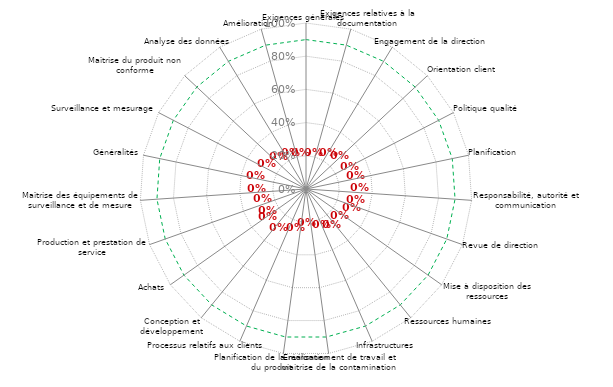
| Category | 90% | Résultats |
|---|---|---|
| 0 | 0.9 | 0 |
| 1 | 0.9 | 0 |
| 2 | 0.9 | 0 |
| 3 | 0.9 | 0 |
| 4 | 0.9 | 0 |
| 5 | 0.9 | 0 |
| 6 | 0.9 | 0 |
| 7 | 0.9 | 0 |
| 8 | 0.9 | 0 |
| 9 | 0.9 | 0 |
| 10 | 0.9 | 0 |
| 11 | 0.9 | 0 |
| 12 | 0.9 | 0 |
| 13 | 0.9 | 0 |
| 14 | 0.9 | 0 |
| 15 | 0.9 | 0 |
| 16 | 0.9 | 0 |
| 17 | 0.9 | 0 |
| 18 | 0.9 | 0 |
| 19 | 0.9 | 0 |
| 20 | 0.9 | 0 |
| 21 | 0.9 | 0 |
| 22 | 0.9 | 0 |